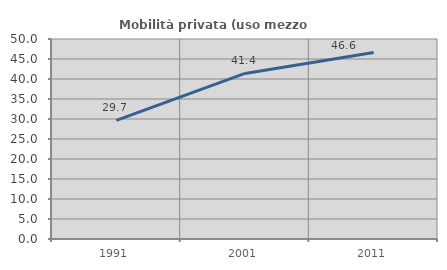
| Category | Mobilità privata (uso mezzo privato) |
|---|---|
| 1991.0 | 29.677 |
| 2001.0 | 41.394 |
| 2011.0 | 46.649 |